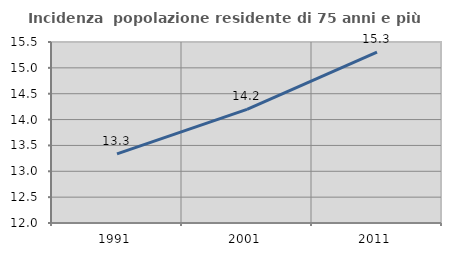
| Category | Incidenza  popolazione residente di 75 anni e più |
|---|---|
| 1991.0 | 13.336 |
| 2001.0 | 14.198 |
| 2011.0 | 15.306 |